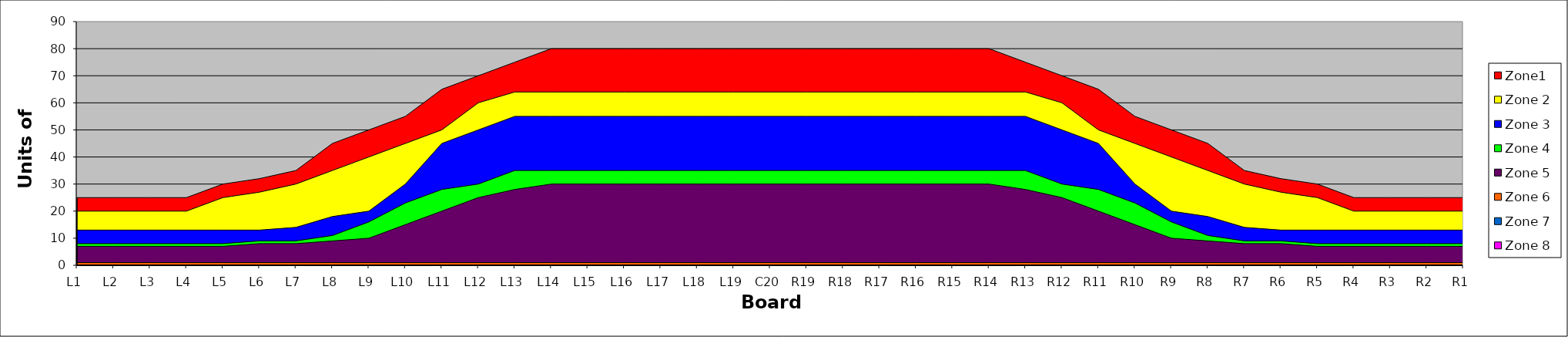
| Category | Zone1 | Zone 2 | Zone 3 | Zone 4 | Zone 5 | Zone 6 | Zone 7 | Zone 8 |
|---|---|---|---|---|---|---|---|---|
| L1 | 25 | 20 | 13 | 8 | 7 | 1 |  |  |
| L2 | 25 | 20 | 13 | 8 | 7 | 1 |  |  |
| L3 | 25 | 20 | 13 | 8 | 7 | 1 |  |  |
| L4 | 25 | 20 | 13 | 8 | 7 | 1 |  |  |
| L5 | 30 | 25 | 13 | 8 | 7 | 1 |  |  |
| L6 | 32 | 27 | 13 | 9 | 8 | 1 |  |  |
| L7 | 35 | 30 | 14 | 9 | 8 | 1 |  |  |
| L8 | 45 | 35 | 18 | 11 | 9 | 1 |  |  |
| L9 | 50 | 40 | 20 | 16 | 10 | 1 |  |  |
| L10 | 55 | 45 | 30 | 23 | 15 | 1 |  |  |
| L11 | 65 | 50 | 45 | 28 | 20 | 1 |  |  |
| L12 | 70 | 60 | 50 | 30 | 25 | 1 |  |  |
| L13 | 75 | 64 | 55 | 35 | 28 | 1 |  |  |
| L14 | 80 | 64 | 55 | 35 | 30 | 1 |  |  |
| L15 | 80 | 64 | 55 | 35 | 30 | 1 |  |  |
| L16 | 80 | 64 | 55 | 35 | 30 | 1 |  |  |
| L17 | 80 | 64 | 55 | 35 | 30 | 1 |  |  |
| L18 | 80 | 64 | 55 | 35 | 30 | 1 |  |  |
| L19 | 80 | 64 | 55 | 35 | 30 | 1 |  |  |
| C20 | 80 | 64 | 55 | 35 | 30 | 1 |  |  |
| R19 | 80 | 64 | 55 | 35 | 30 | 1 |  |  |
| R18 | 80 | 64 | 55 | 35 | 30 | 1 |  |  |
| R17 | 80 | 64 | 55 | 35 | 30 | 1 |  |  |
| R16 | 80 | 64 | 55 | 35 | 30 | 1 |  |  |
| R15 | 80 | 64 | 55 | 35 | 30 | 1 |  |  |
| R14 | 80 | 64 | 55 | 35 | 30 | 1 |  |  |
| R13 | 75 | 64 | 55 | 35 | 28 | 1 |  |  |
| R12 | 70 | 60 | 50 | 30 | 25 | 1 |  |  |
| R11 | 65 | 50 | 45 | 28 | 20 | 1 |  |  |
| R10 | 55 | 45 | 30 | 23 | 15 | 1 |  |  |
| R9 | 50 | 40 | 20 | 16 | 10 | 1 |  |  |
| R8 | 45 | 35 | 18 | 11 | 9 | 1 |  |  |
| R7 | 35 | 30 | 14 | 9 | 8 | 1 |  |  |
| R6 | 32 | 27 | 13 | 9 | 8 | 1 |  |  |
| R5 | 30 | 25 | 13 | 8 | 7 | 1 |  |  |
| R4 | 25 | 20 | 13 | 8 | 7 | 1 |  |  |
| R3 | 25 | 20 | 13 | 8 | 7 | 1 |  |  |
| R2 | 25 | 20 | 13 | 8 | 7 | 1 |  |  |
| R1 | 25 | 20 | 13 | 8 | 7 | 1 |  |  |